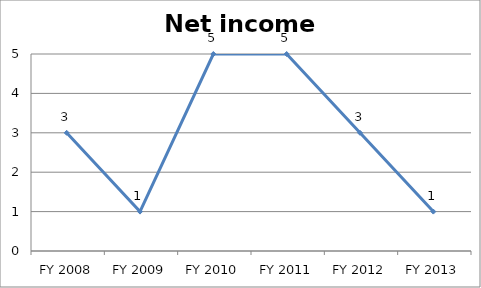
| Category | Net income score |
|---|---|
| FY 2013 | 1 |
| FY 2012 | 3 |
| FY 2011 | 5 |
| FY 2010 | 5 |
| FY 2009 | 1 |
| FY 2008 | 3 |